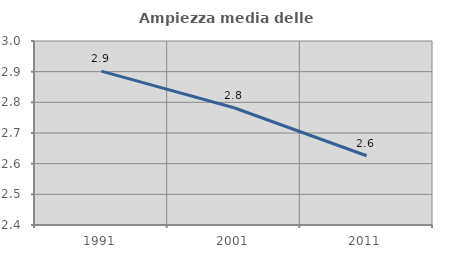
| Category | Ampiezza media delle famiglie |
|---|---|
| 1991.0 | 2.902 |
| 2001.0 | 2.782 |
| 2011.0 | 2.626 |